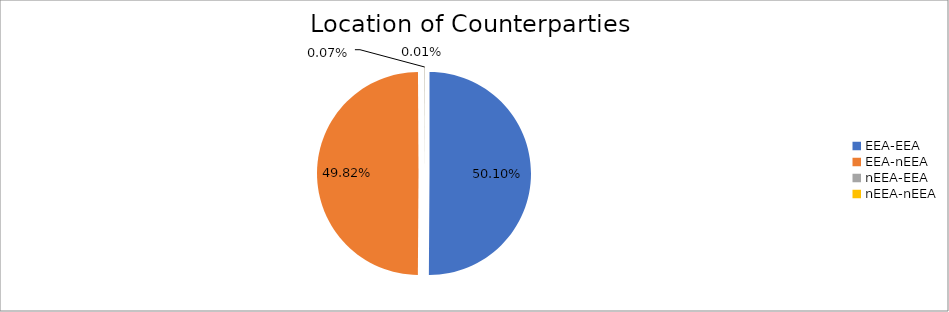
| Category | Series 0 |
|---|---|
| EEA-EEA | 5934219.379 |
| EEA-nEEA | 5900966.441 |
| nEEA-EEA | 8869.111 |
| nEEA-nEEA | 1038.384 |